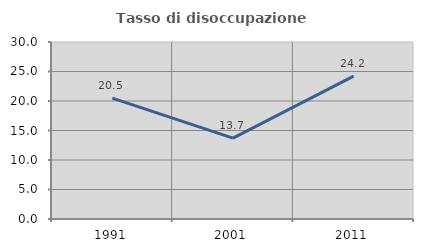
| Category | Tasso di disoccupazione giovanile  |
|---|---|
| 1991.0 | 20.495 |
| 2001.0 | 13.706 |
| 2011.0 | 24.224 |